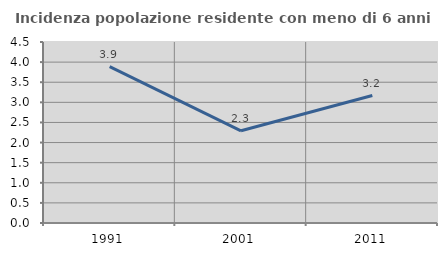
| Category | Incidenza popolazione residente con meno di 6 anni |
|---|---|
| 1991.0 | 3.89 |
| 2001.0 | 2.293 |
| 2011.0 | 3.168 |